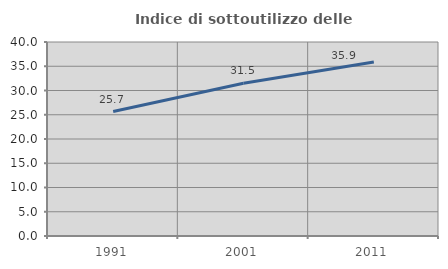
| Category | Indice di sottoutilizzo delle abitazioni  |
|---|---|
| 1991.0 | 25.656 |
| 2001.0 | 31.496 |
| 2011.0 | 35.866 |